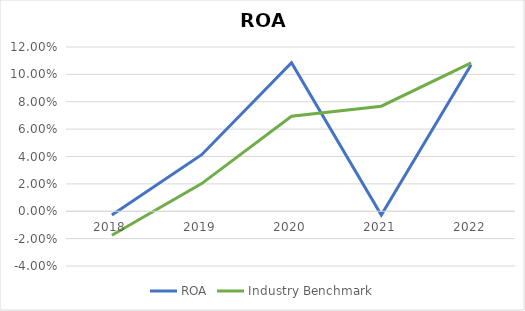
| Category | ROA | Industry Benchmark |
|---|---|---|
| 2018.0 | -0.003 | -0.018 |
| 2019.0 | 0.041 | 0.02 |
| 2020.0 | 0.108 | 0.069 |
| 2021.0 | -0.003 | 0.077 |
| 2022.0 | 0.107 | 0.108 |